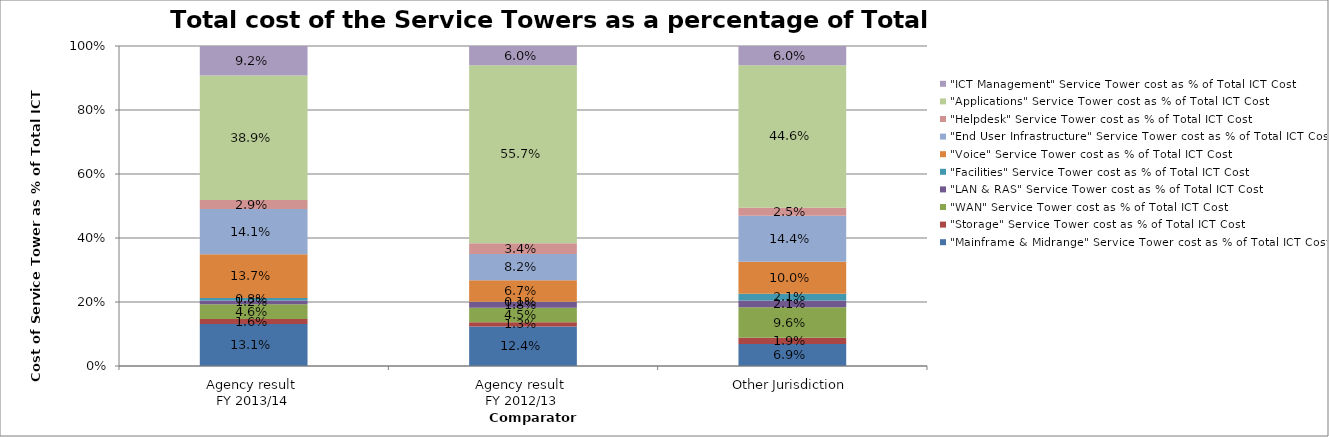
| Category | "Mainframe & Midrange" Service Tower cost as % of Total ICT Cost | "Storage" Service Tower cost as % of Total ICT Cost | "WAN" Service Tower cost as % of Total ICT Cost | "LAN & RAS" Service Tower cost as % of Total ICT Cost | "Facilities" Service Tower cost as % of Total ICT Cost | "Voice" Service Tower cost as % of Total ICT Cost | "End User Infrastructure" Service Tower cost as % of Total ICT Cost | "Helpdesk" Service Tower cost as % of Total ICT Cost | "Applications" Service Tower cost as % of Total ICT Cost | "ICT Management" Service Tower cost as % of Total ICT Cost |
|---|---|---|---|---|---|---|---|---|---|---|
| Agency result 
FY 2013/14 | 0.131 | 0.016 | 0.046 | 0.012 | 0.008 | 0.137 | 0.141 | 0.029 | 0.389 | 0.092 |
| Agency result 
FY 2012/13 | 0.124 | 0.013 | 0.045 | 0.018 | 0.001 | 0.067 | 0.082 | 0.034 | 0.556 | 0.06 |
| Other Jurisdiction | 0.069 | 0.019 | 0.096 | 0.021 | 0.021 | 0.1 | 0.144 | 0.025 | 0.446 | 0.06 |